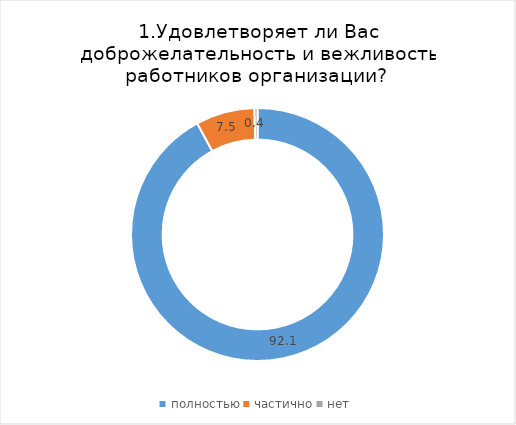
| Category | Итого по области |
|---|---|
| полностью | 92.095 |
| частично | 7.519 |
| нет | 0.385 |